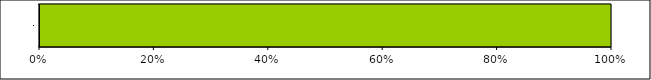
| Category | Series 0 | Series 1 | Series 2 | Series 3 |
|---|---|---|---|---|
| 0 | 0 | 0 | 7 | 0 |